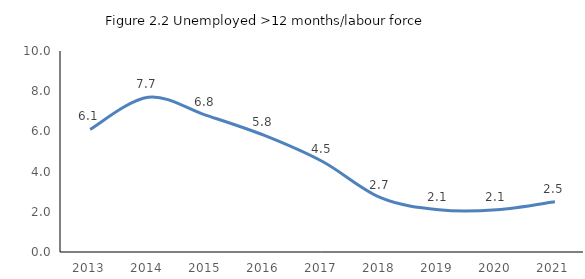
| Category | Unemployed>12 months/labour force % |
|---|---|
| 2013.0 | 6.1 |
| 2014.0 | 7.7 |
| 2015.0 | 6.8 |
| 2016.0 | 5.8 |
| 2017.0 | 4.5 |
| 2018.0 | 2.7 |
| 2019.0 | 2.1 |
| 2020.0 | 2.1 |
| 2021.0 | 2.5 |